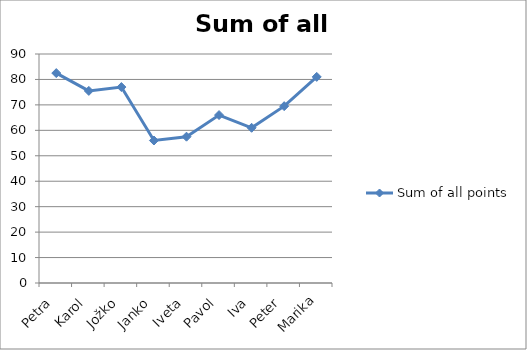
| Category | Sum of all points |
|---|---|
| Petra | 82.5 |
| Karol | 75.5 |
| Jožko | 77 |
| Janko | 56 |
| Iveta | 57.5 |
| Pavol | 66 |
| Iva | 61 |
| Peter | 69.5 |
| Marika | 81 |